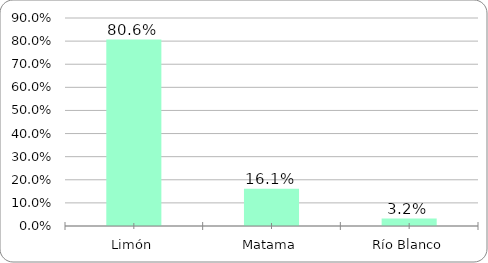
| Category | Series 0 |
|---|---|
| Limón | 0.806 |
| Matama | 0.161 |
| Río Blanco | 0.032 |